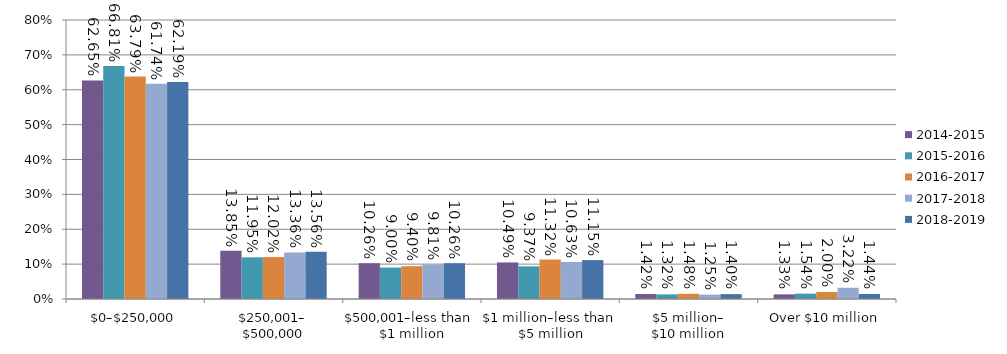
| Category | 2014-2015 | 2015-2016 | 2016-2017 | 2017-2018 | 2018-2019 |
|---|---|---|---|---|---|
| $0–$250,000 | 0.627 | 0.668 | 0.638 | 0.617 | 0.622 |
| $250,001–
$500,000 | 0.138 | 0.119 | 0.12 | 0.134 | 0.136 |
| $500,001–less than 
$1 million | 0.103 | 0.09 | 0.094 | 0.098 | 0.103 |
| $1 million–less than 
$5 million | 0.105 | 0.094 | 0.113 | 0.106 | 0.111 |
| $5 million–
$10 million | 0.014 | 0.013 | 0.015 | 0.012 | 0.014 |
| Over $10 million | 0.013 | 0.015 | 0.02 | 0.032 | 0.014 |